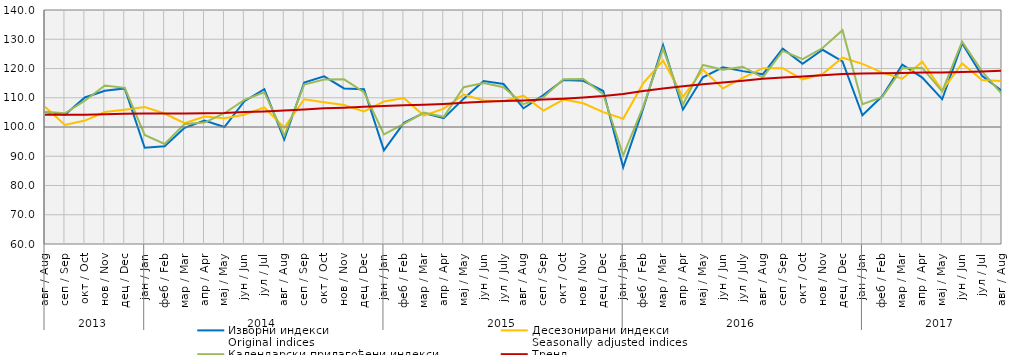
| Category | Изворни индекси
Original indices | Десезонирани индекси
Seasonally adjusted indices | Календарски прилагођени индекси
Working-day adjusted indices | Тренд
Trend |
|---|---|---|---|---|
| 0 | 105.1 | 106.9 | 105.2 | 104.2 |
| 1 | 104.2 | 100.7 | 104.7 | 104.2 |
| 2 | 110.1 | 102.2 | 109 | 104.2 |
| 3 | 112.4 | 105.1 | 114.2 | 104.4 |
| 4 | 113.2 | 105.9 | 113.4 | 104.5 |
| 5 | 92.9 | 106.8 | 97.3 | 104.6 |
| 6 | 93.4 | 104.6 | 94.2 | 104.6 |
| 7 | 99.7 | 101.3 | 101 | 104.6 |
| 8 | 102.2 | 103.6 | 101.5 | 104.7 |
| 9 | 100 | 103 | 104.7 | 104.8 |
| 10 | 108.8 | 104.2 | 109.3 | 105.1 |
| 11 | 112.9 | 106.7 | 111.9 | 105.3 |
| 12 | 95.8 | 99.8 | 97 | 105.6 |
| 13 | 115.2 | 109.5 | 114.5 | 106 |
| 14 | 117.3 | 108.5 | 116.2 | 106.4 |
| 15 | 113.2 | 107.5 | 116.3 | 106.6 |
| 16 | 112.9 | 105.3 | 111.9 | 106.9 |
| 17 | 92 | 108.7 | 97.5 | 107.2 |
| 18 | 101.4 | 109.9 | 101.1 | 107.4 |
| 19 | 104.8 | 103.9 | 104.9 | 107.6 |
| 20 | 103 | 106.3 | 103.5 | 107.9 |
| 21 | 109.7 | 111.1 | 113.6 | 108.3 |
| 22 | 115.7 | 109.1 | 115 | 108.6 |
| 23 | 114.7 | 108.8 | 113.6 | 108.9 |
| 24 | 106.4 | 110.7 | 107.8 | 109.1 |
| 25 | 110.9 | 105.6 | 110.2 | 109.4 |
| 26 | 116.1 | 109.4 | 116.3 | 109.7 |
| 27 | 115.8 | 108.1 | 116.4 | 110.1 |
| 28 | 112.3 | 105.1 | 111.2 | 110.6 |
| 29 | 86.2 | 102.8 | 90.3 | 111.3 |
| 30 | 106.3 | 114.9 | 106.9 | 112.3 |
| 31 | 128 | 122.7 | 126.8 | 113.2 |
| 32 | 106 | 110.3 | 107.7 | 113.9 |
| 33 | 117 | 119.6 | 121.2 | 114.6 |
| 34 | 120.4 | 113.2 | 119.6 | 115.2 |
| 35 | 119.1 | 116.8 | 120.6 | 115.8 |
| 36 | 118 | 120.1 | 116.9 | 116.5 |
| 37 | 126.8 | 120.1 | 126 | 116.9 |
| 38 | 121.6 | 116.3 | 123.2 | 117.3 |
| 39 | 126.4 | 118.1 | 127 | 117.7 |
| 40 | 122.4 | 123.7 | 133.1 | 118.1 |
| 41 | 104 | 121.6 | 107.8 | 118.3 |
| 42 | 110.6 | 118.6 | 110.3 | 118.4 |
| 43 | 121.3 | 116.5 | 120.1 | 118.5 |
| 44 | 116.9 | 122.3 | 120.2 | 118.6 |
| 45 | 109.5 | 112.5 | 112.2 | 118.6 |
| 46 | 128.6 | 121.7 | 129.2 | 118.8 |
| 47 | 117.5 | 116.1 | 119 | 119 |
| 48 | 112.3 | 115.7 | 111.2 | 119.2 |